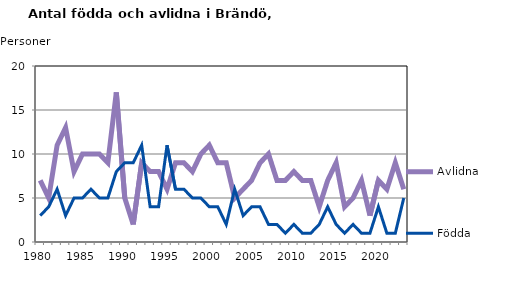
| Category | Avlidna | Födda |
|---|---|---|
| 1980.0 | 7 | 3 |
| 1981.0 | 5 | 4 |
| 1982.0 | 11 | 6 |
| 1983.0 | 13 | 3 |
| 1984.0 | 8 | 5 |
| 1985.0 | 10 | 5 |
| 1986.0 | 10 | 6 |
| 1987.0 | 10 | 5 |
| 1988.0 | 9 | 5 |
| 1989.0 | 17 | 8 |
| 1990.0 | 5 | 9 |
| 1991.0 | 2 | 9 |
| 1992.0 | 9 | 11 |
| 1993.0 | 8 | 4 |
| 1994.0 | 8 | 4 |
| 1995.0 | 6 | 11 |
| 1996.0 | 9 | 6 |
| 1997.0 | 9 | 6 |
| 1998.0 | 8 | 5 |
| 1999.0 | 10 | 5 |
| 2000.0 | 11 | 4 |
| 2001.0 | 9 | 4 |
| 2002.0 | 9 | 2 |
| 2003.0 | 5 | 6 |
| 2004.0 | 6 | 3 |
| 2005.0 | 7 | 4 |
| 2006.0 | 9 | 4 |
| 2007.0 | 10 | 2 |
| 2008.0 | 7 | 2 |
| 2009.0 | 7 | 1 |
| 2010.0 | 8 | 2 |
| 2011.0 | 7 | 1 |
| 2012.0 | 7 | 1 |
| 2013.0 | 4 | 2 |
| 2014.0 | 7 | 4 |
| 2015.0 | 9 | 2 |
| 2016.0 | 4 | 1 |
| 2017.0 | 5 | 2 |
| 2018.0 | 7 | 1 |
| 2019.0 | 3 | 1 |
| 2020.0 | 7 | 4 |
| 2021.0 | 6 | 1 |
| 2022.0 | 9 | 1 |
| 2023.0 | 6 | 5 |